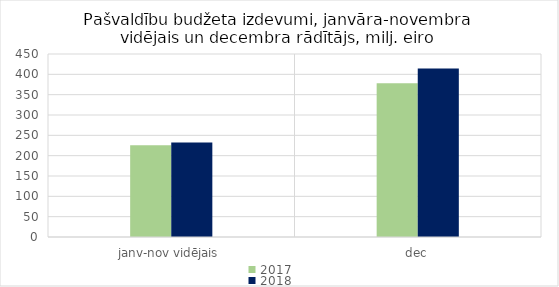
| Category | 2017 | 2018 |
|---|---|---|
| janv-nov vidējais | 225428.083 | 232075 |
| dec | 378007.978 | 414250.751 |